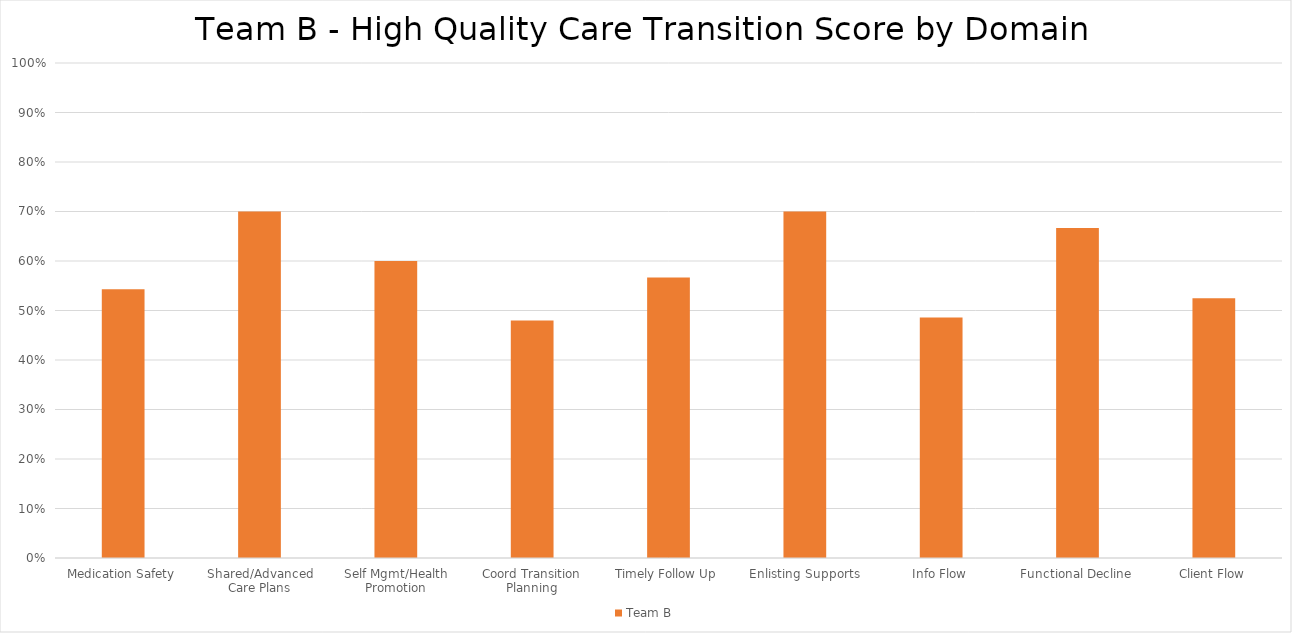
| Category | Team B |
|---|---|
| Medication Safety | 0.543 |
| Shared/Advanced Care Plans | 0.7 |
| Self Mgmt/Health Promotion | 0.6 |
| Coord Transition Planning | 0.48 |
| Timely Follow Up | 0.567 |
| Enlisting Supports | 0.7 |
| Info Flow | 0.486 |
| Functional Decline | 0.667 |
| Client Flow | 0.525 |